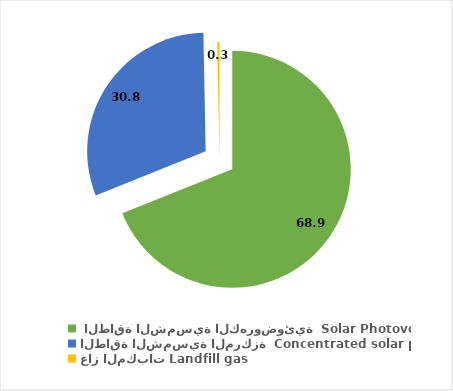
| Category | 2017 |
|---|---|
| 0 | 68.923 |
| 1 | 30.769 |
| 2 | 0.308 |